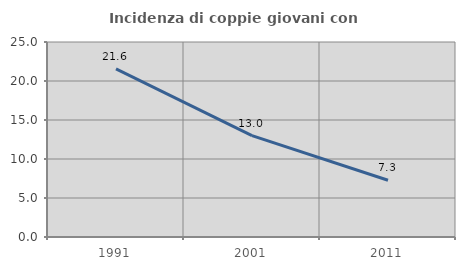
| Category | Incidenza di coppie giovani con figli |
|---|---|
| 1991.0 | 21.555 |
| 2001.0 | 12.988 |
| 2011.0 | 7.272 |